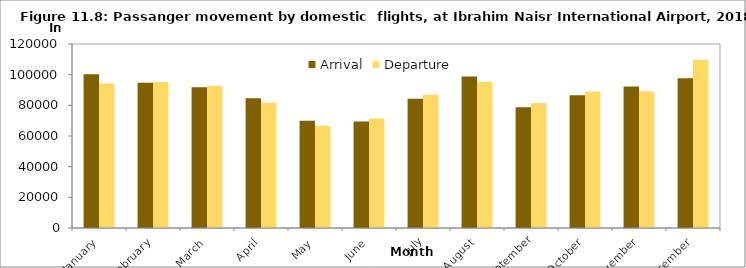
| Category | Arrival | Departure |
|---|---|---|
| January | 100248 | 94294 |
| February | 94774 | 95166 |
| March | 91796 | 92842 |
| April | 84640 | 81740 |
| May | 69951 | 66606 |
| June | 69442 | 71382 |
| July | 84244 | 86831 |
| August | 98729 | 95383 |
| September | 78698 | 81579 |
| October | 86499 | 89081 |
| November | 92303 | 89172 |
| December | 97716 | 109769 |